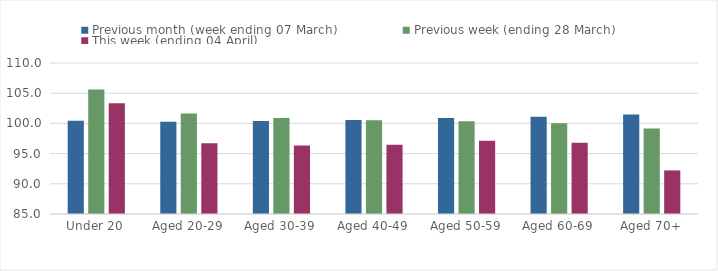
| Category | Previous month (week ending 07 March) | Previous week (ending 28 March) | This week (ending 04 April) |
|---|---|---|---|
| Under 20 | 100.443 | 105.609 | 103.347 |
| Aged 20-29 | 100.261 | 101.645 | 96.724 |
| Aged 30-39 | 100.403 | 100.908 | 96.358 |
| Aged 40-49 | 100.581 | 100.536 | 96.462 |
| Aged 50-59 | 100.91 | 100.358 | 97.12 |
| Aged 60-69 | 101.08 | 100.016 | 96.816 |
| Aged 70+ | 101.481 | 99.141 | 92.216 |